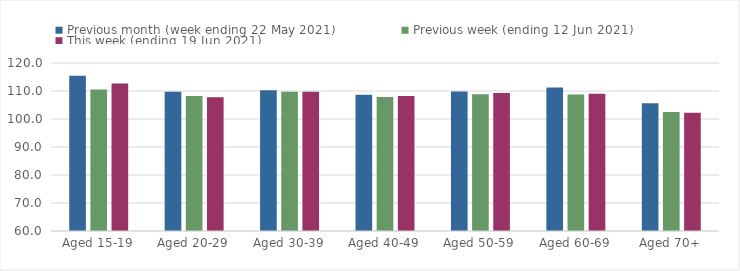
| Category | Previous month (week ending 22 May 2021) | Previous week (ending 12 Jun 2021) | This week (ending 19 Jun 2021) |
|---|---|---|---|
| Aged 15-19 | 115.45 | 110.55 | 112.68 |
| Aged 20-29 | 109.75 | 108.24 | 107.75 |
| Aged 30-39 | 110.27 | 109.7 | 109.69 |
| Aged 40-49 | 108.68 | 107.84 | 108.18 |
| Aged 50-59 | 109.84 | 108.82 | 109.27 |
| Aged 60-69 | 111.27 | 108.74 | 109.05 |
| Aged 70+ | 105.64 | 102.49 | 102.2 |